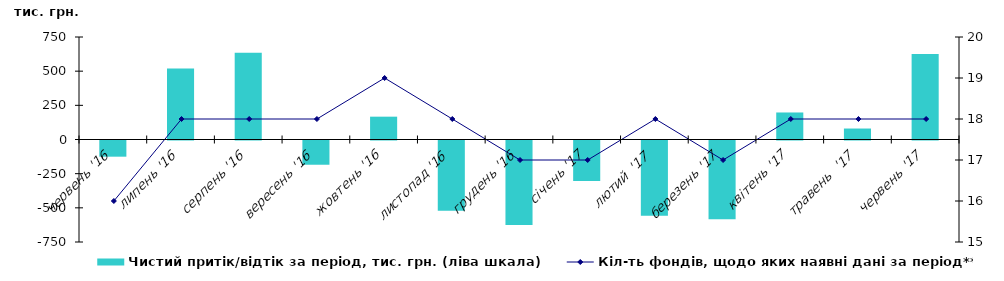
| Category | Чистий притік/відтік за період, тис. грн. (ліва шкала) |
|---|---|
| червень '16 | -118.43 |
| липень '16 | 518.723 |
| серпень '16 | 634.208 |
| вересень '16 | -177.364 |
| жовтень '16 | 167.033 |
| листопад '16 | -514.847 |
| грудень '16 | -617.651 |
| січень '17 | -295.873 |
| лютий  '17 | -551.202 |
| березень '17 | -576.733 |
| квітень '17 | 197.722 |
| травень  '17 | 80.282 |
| червень '17 | 625.568 |